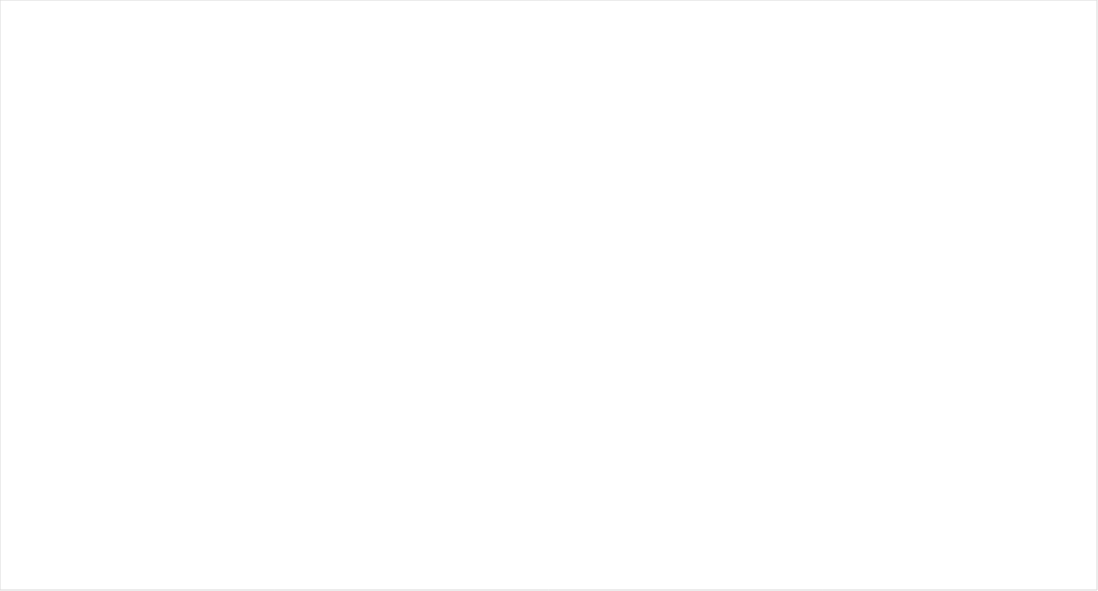
| Category | Total |
|---|---|
| GFPSC–1 | 1.5 |
| GFPSC–2 | 4 |
| GFPSC–3 | 2 |
| GFPSC–4 | 0 |
| GFPSC–5 | 1 |
| GFPSC–6 | 2 |
| GFPSC–7 | 1 |
| GFPSC–8 | 1 |
| GFPSC–9 | 1 |